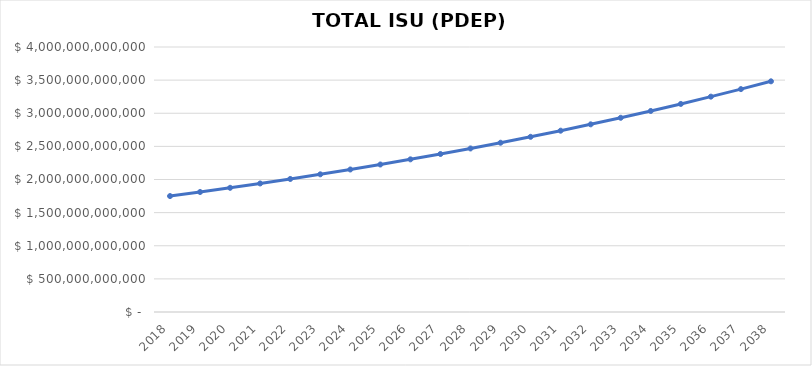
| Category | TOTAL ISU (PDEP) |
|---|---|
| 2018.0 | 1749944232795.231 |
| 2019.0 | 1811192280943.064 |
| 2020.0 | 1874584010776.071 |
| 2021.0 | 1940194451153.233 |
| 2022.0 | 2008101256943.596 |
| 2023.0 | 2078384800936.622 |
| 2024.0 | 2151128268969.403 |
| 2025.0 | 2226417758383.332 |
| 2026.0 | 2304342379926.749 |
| 2027.0 | 2384994363224.185 |
| 2028.0 | 2468469165937.031 |
| 2029.0 | 2554865586744.827 |
| 2030.0 | 2644285882280.896 |
| 2031.0 | 2736835888160.727 |
| 2032.0 | 2832625144246.352 |
| 2033.0 | 2931767024294.974 |
| 2034.0 | 3034378870145.298 |
| 2035.0 | 3140582130600.384 |
| 2036.0 | 3250502505171.397 |
| 2037.0 | 3364270092852.396 |
| 2038.0 | 3482019546102.229 |